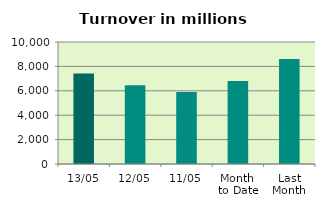
| Category | Series 0 |
|---|---|
| 13/05 | 7427.668 |
| 12/05 | 6464.497 |
| 11/05 | 5892.708 |
| Month 
to Date | 6809.423 |
| Last
Month | 8604.869 |